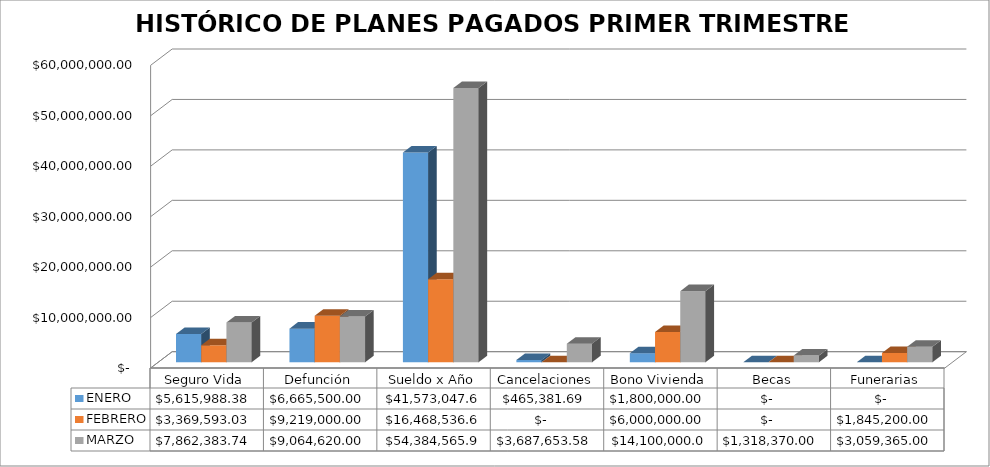
| Category | ENERO | FEBRERO | MARZO |
|---|---|---|---|
| Seguro Vida | 5615988.38 | 3369593.03 | 7862383.74 |
| Defunción | 6665500 | 9219000 | 9064620 |
| Sueldo x Año | 41573047.64 | 16468536.69 | 54384565.92 |
| Cancelaciones | 465381.69 | 0 | 3687653.58 |
| Bono Vivienda | 1800000 | 6000000 | 14100000 |
| Becas | 0 | 0 | 1318370 |
| Funerarias | 0 | 1845200 | 3059365 |